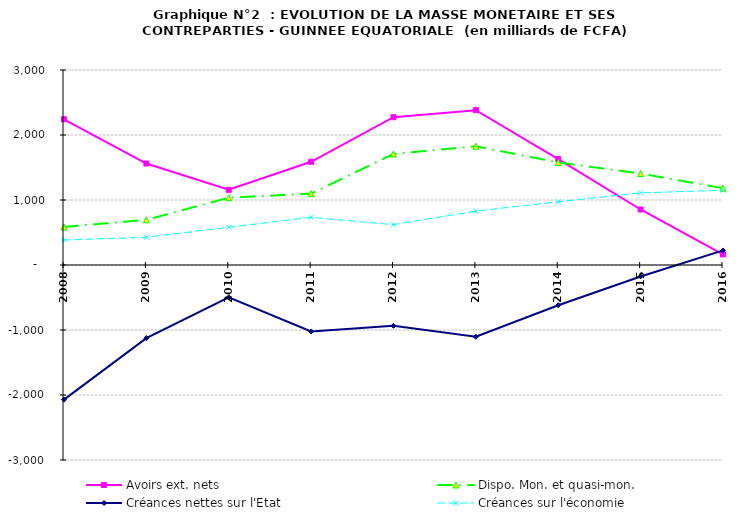
| Category | Avoirs ext. nets | Dispo. Mon. et quasi-mon. | Créances nettes sur l'Etat | Créances sur l'économie |
|---|---|---|---|---|
| 2008.0 | 2241686 | 585383 | -2071317 | 384338 |
| 2009.0 | 1561361 | 695250 | -1124659 | 426100 |
| 2010.0 | 1156706 | 1035101 | -496949 | 581299 |
| 2011.0 | 1588307 | 1098314 | -1022210 | 732964 |
| 2012.0 | 2273412 | 1708871 | -935186 | 620714 |
| 2013.0 | 2382216 | 1826931 | -1103958 | 829113 |
| 2014.0 | 1629105 | 1577778 | -618905 | 972902 |
| 2015.0 | 854095 | 1407204 | -176022 | 1109174 |
| 2016.0 | 162715 | 1181613 | 224263 | 1150292 |